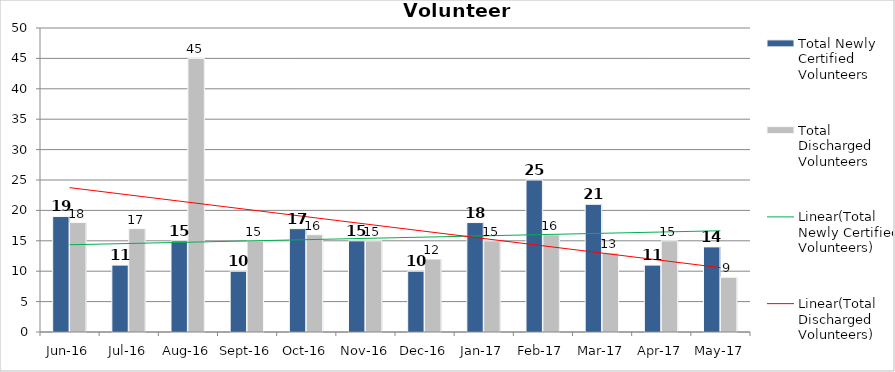
| Category | Total Newly Certified Volunteers | Total Discharged Volunteers |
|---|---|---|
| Jun-16 | 19 | 18 |
| Jul-16 | 11 | 17 |
| Aug-16 | 15 | 45 |
| Sep-16 | 10 | 15 |
| Oct-16 | 17 | 16 |
| Nov-16 | 15 | 15 |
| Dec-16 | 10 | 12 |
| Jan-17 | 18 | 15 |
| Feb-17 | 25 | 16 |
| Mar-17 | 21 | 13 |
| Apr-17 | 11 | 15 |
| May-17 | 14 | 9 |